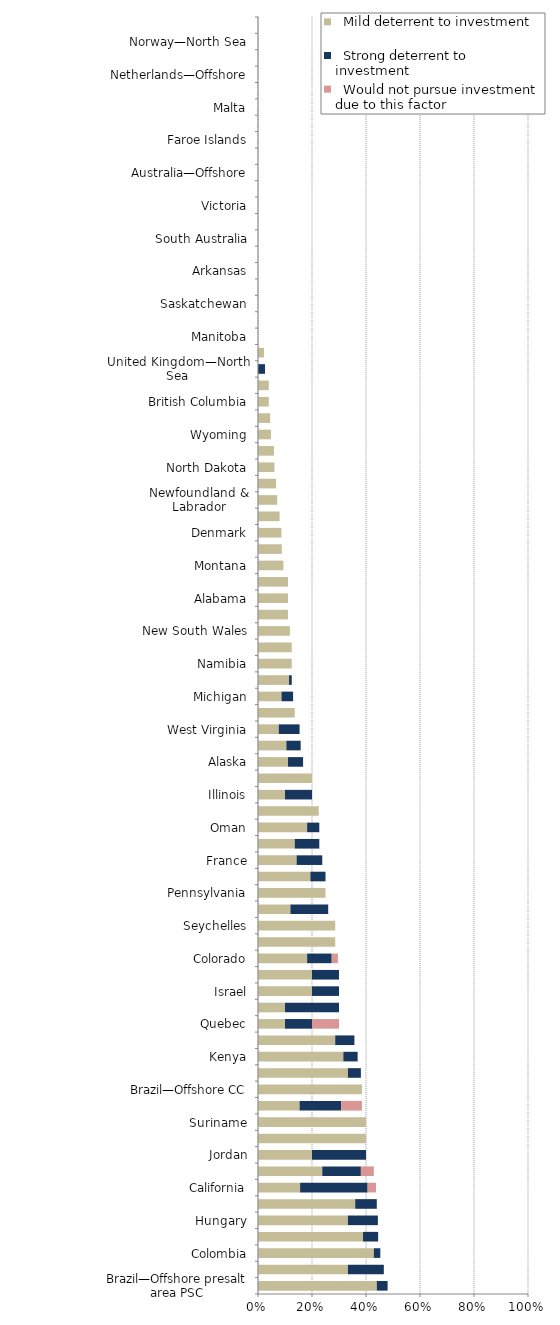
| Category |   Mild deterrent to investment |   Strong deterrent to investment |   Would not pursue investment due to this factor |
|---|---|---|---|
| Brazil—Offshore presalt area PSC | 0.44 | 0.04 | 0 |
| New York | 0.333 | 0.133 | 0 |
| Colombia | 0.429 | 0.024 | 0 |
| Brazil—Onshore CC | 0.389 | 0.056 | 0 |
| Hungary | 0.333 | 0.111 | 0 |
| Ghana | 0.36 | 0.08 | 0 |
| California | 0.156 | 0.25 | 0.031 |
| Brunei | 0.238 | 0.143 | 0.048 |
| Jordan | 0.2 | 0.2 | 0 |
| French Guiana | 0.4 | 0 | 0 |
| Suriname | 0.4 | 0 | 0 |
| Madagascar | 0.154 | 0.154 | 0.077 |
| Brazil—Offshore CC | 0.385 | 0 | 0 |
| United Arab Emirates | 0.333 | 0.048 | 0 |
| Kenya | 0.316 | 0.053 | 0 |
| Spain—Offshore | 0.286 | 0.071 | 0 |
| Quebec | 0.1 | 0.1 | 0.1 |
| Japan | 0.1 | 0.2 | 0 |
| Israel | 0.2 | 0.1 | 0 |
| Uruguay | 0.2 | 0.1 | 0 |
| Colorado | 0.182 | 0.091 | 0.023 |
| Spain—Onshore | 0.286 | 0 | 0 |
| Seychelles | 0.286 | 0 | 0 |
| Louisiana | 0.12 | 0.14 | 0 |
| Pennsylvania | 0.25 | 0 | 0 |
| US Offshore—Gulf of Mexico | 0.194 | 0.056 | 0 |
| France | 0.143 | 0.095 | 0 |
| Trinidad and Tobago | 0.136 | 0.091 | 0 |
| Oman | 0.182 | 0.045 | 0 |
| New Mexico | 0.225 | 0 | 0 |
| Illinois | 0.1 | 0.1 | 0 |
| US Offshore—Alaska | 0.2 | 0 | 0 |
| Alaska | 0.111 | 0.056 | 0 |
| Ireland | 0.105 | 0.053 | 0 |
| West Virginia | 0.077 | 0.077 | 0 |
| Ohio | 0.136 | 0 | 0 |
| Michigan | 0.087 | 0.043 | 0 |
| Texas | 0.115 | 0.01 | 0 |
| Namibia | 0.125 | 0 | 0 |
| Chile | 0.125 | 0 | 0 |
| New South Wales | 0.118 | 0 | 0 |
| New Brunswick | 0.111 | 0 | 0 |
| Alabama | 0.111 | 0 | 0 |
| Oklahoma | 0.111 | 0 | 0 |
| Montana | 0.094 | 0 | 0 |
| Kansas | 0.088 | 0 | 0 |
| Denmark | 0.087 | 0 | 0 |
| Mississippi | 0.08 | 0 | 0 |
| Newfoundland & Labrador | 0.071 | 0 | 0 |
| Nova Scotia | 0.067 | 0 | 0 |
| North Dakota | 0.061 | 0 | 0 |
| Germany | 0.059 | 0 | 0 |
| Wyoming | 0.048 | 0 | 0 |
| Utah | 0.045 | 0 | 0 |
| British Columbia | 0.04 | 0 | 0 |
| Queensland | 0.04 | 0 | 0 |
| United Kingdom—North Sea | 0 | 0.026 | 0 |
| Alberta | 0.022 | 0 | 0 |
| Manitoba | 0 | 0 | 0 |
| Northwest Territories | 0 | 0 | 0 |
| Saskatchewan | 0 | 0 | 0 |
| Yukon | 0 | 0 | 0 |
| Arkansas | 0 | 0 | 0 |
| Northern Territory | 0 | 0 | 0 |
| South Australia | 0 | 0 | 0 |
| Tasmania | 0 | 0 | 0 |
| Victoria | 0 | 0 | 0 |
| Western Australia | 0 | 0 | 0 |
| Australia—Offshore | 0 | 0 | 0 |
| New Zealand | 0 | 0 | 0 |
| Faroe Islands | 0 | 0 | 0 |
| Greenland | 0 | 0 | 0 |
| Malta | 0 | 0 | 0 |
| Netherlands—Onshore | 0 | 0 | 0 |
| Netherlands—Offshore | 0 | 0 | 0 |
| Norway—Other Offshore (except North Sea) | 0 | 0 | 0 |
| Norway—North Sea | 0 | 0 | 0 |
| UK—Other Offshore (except North Sea) | 0 | 0 | 0 |